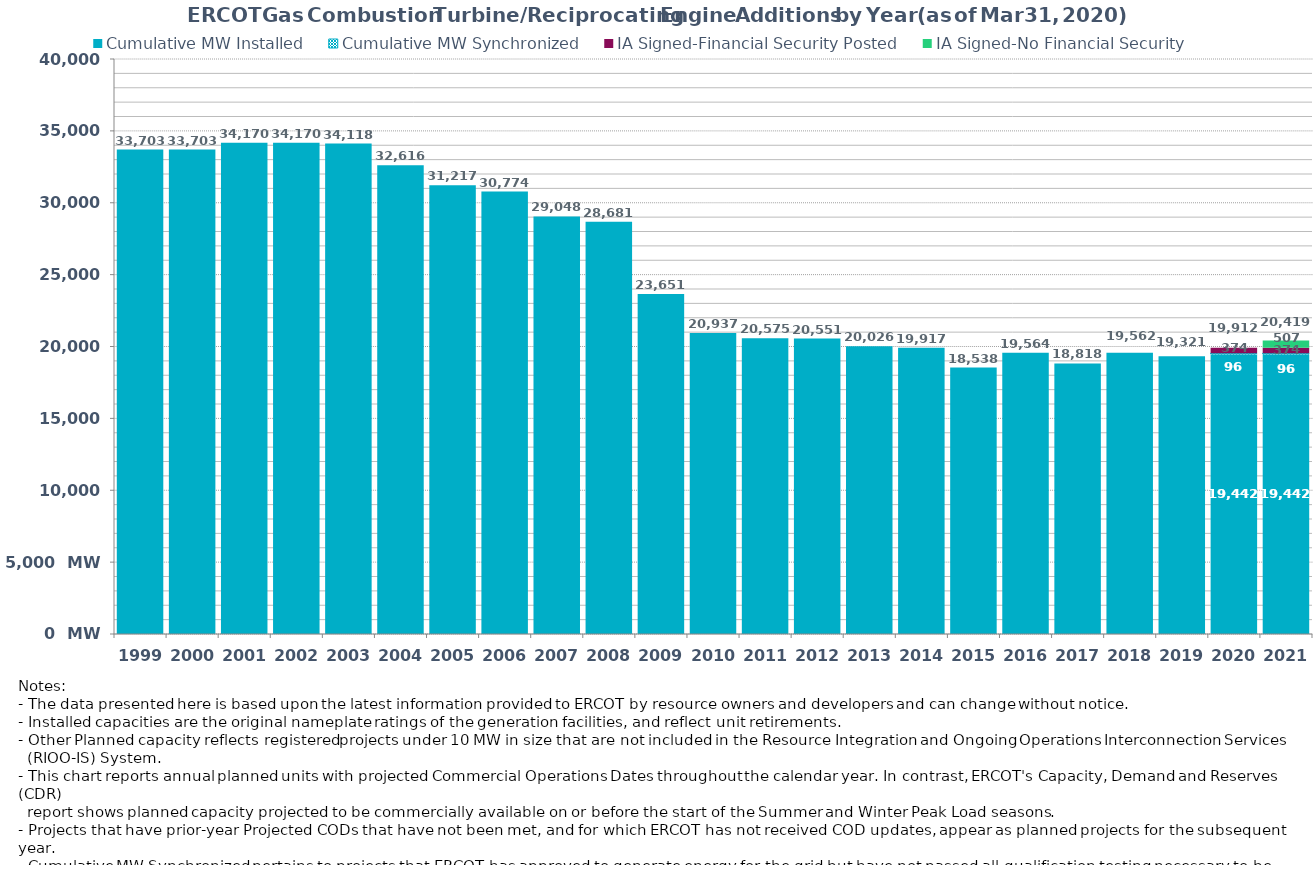
| Category | Cumulative MW Installed | Cumulative MW Synchronized | IA Signed-Financial Security Posted  | IA Signed-No Financial Security  | Other Planned | Cumulative Installed and Planned |
|---|---|---|---|---|---|---|
| 1999.0 | 33703 | 0 | 0 | 0 | 0 | 33703 |
| 2000.0 | 33703 | 0 | 0 | 0 | 0 | 33703 |
| 2001.0 | 34170 | 0 | 0 | 0 | 0 | 34170 |
| 2002.0 | 34170 | 0 | 0 | 0 | 0 | 34170 |
| 2003.0 | 34118 | 0 | 0 | 0 | 0 | 34118 |
| 2004.0 | 32616 | 0 | 0 | 0 | 0 | 32616 |
| 2005.0 | 31217 | 0 | 0 | 0 | 0 | 31217 |
| 2006.0 | 30774 | 0 | 0 | 0 | 0 | 30774 |
| 2007.0 | 29048 | 0 | 0 | 0 | 0 | 29048 |
| 2008.0 | 28681 | 0 | 0 | 0 | 0 | 28681 |
| 2009.0 | 23651 | 0 | 0 | 0 | 0 | 23651 |
| 2010.0 | 20937 | 0 | 0 | 0 | 0 | 20937 |
| 2011.0 | 20575 | 0 | 0 | 0 | 0 | 20575 |
| 2012.0 | 20551 | 0 | 0 | 0 | 0 | 20551 |
| 2013.0 | 20026 | 0 | 0 | 0 | 0 | 20026 |
| 2014.0 | 19917 | 0 | 0 | 0 | 0 | 19917 |
| 2015.0 | 18538 | 0 | 0 | 0 | 0 | 18538 |
| 2016.0 | 19564 | 0 | 0 | 0 | 0 | 19564 |
| 2017.0 | 18818 | 0 | 0 | 0 | 0 | 18818 |
| 2018.0 | 19562 | 0 | 0 | 0 | 0 | 19562 |
| 2019.0 | 19320.7 | 0 | 0 | 0 | 0 | 19320.7 |
| 2020.0 | 19441.7 | 96 | 374 | 0 | 0 | 19911.7 |
| 2021.0 | 19441.7 | 96 | 374 | 507 | 0 | 20418.7 |